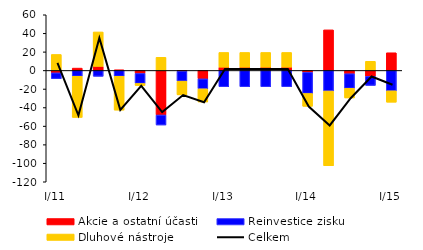
| Category | Akcie a ostatní účasti | Reinvestice zisku | Dluhové nástroje |
|---|---|---|---|
| I/11 | -2.569 | -6.291 | 17.255 |
| II | 2.527 | -6.291 | -44.364 |
| III | 4.362 | -6.291 | 37.132 |
| IV | 0.507 | -6.291 | -36.489 |
| I/12 | -3.253 | -10.785 | -2.251 |
| II | -48.016 | -10.785 | 14.16 |
| III | -0.777 | -10.785 | -14.771 |
| IV | -9.051 | -10.785 | -14.161 |
| I/13 | 3.515 | -17.551 | 15.896 |
| II | 3.515 | -17.551 | 15.896 |
| III | 3.515 | -17.551 | 15.896 |
| IV | 3.515 | -17.551 | 15.896 |
| I/14 | -2.088 | -22.755 | -13.843 |
| II | 43.736 | -22.199 | -80.565 |
| III | -3.51 | -15.748 | -10.404 |
| IV | -6.372 | -9.765 | 9.879 |
| I/15 | 19.073 | -21.986 | -12.274 |